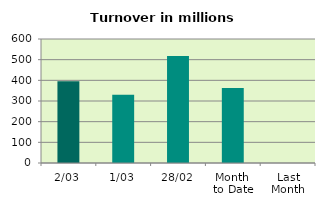
| Category | Series 0 |
|---|---|
| 2/03 | 395.73 |
| 1/03 | 330.404 |
| 28/02 | 517.643 |
| Month 
to Date | 363.067 |
| Last
Month | 0 |